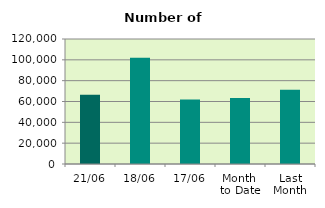
| Category | Series 0 |
|---|---|
| 21/06 | 66560 |
| 18/06 | 101898 |
| 17/06 | 61922 |
| Month 
to Date | 63282 |
| Last
Month | 71249.7 |